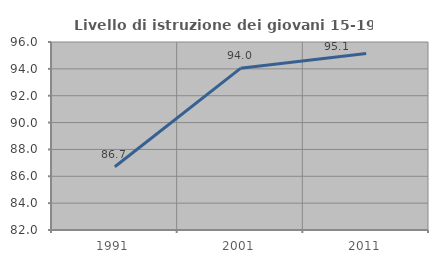
| Category | Livello di istruzione dei giovani 15-19 anni |
|---|---|
| 1991.0 | 86.706 |
| 2001.0 | 94.04 |
| 2011.0 | 95.137 |